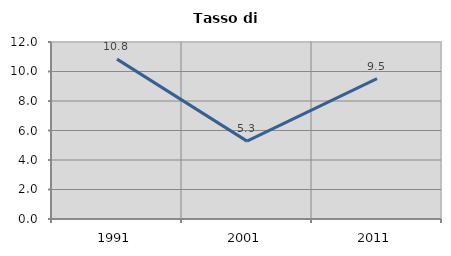
| Category | Tasso di disoccupazione   |
|---|---|
| 1991.0 | 10.839 |
| 2001.0 | 5.28 |
| 2011.0 | 9.518 |